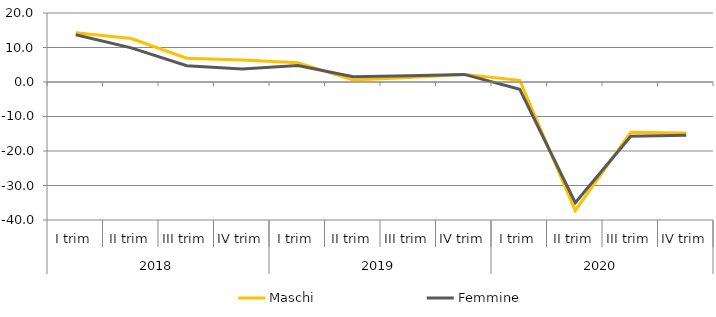
| Category | Maschi | Femmine |
|---|---|---|
| 0 | 14.3 | 13.7 |
| 1 | 12.6 | 9.9 |
| 2 | 6.9 | 4.7 |
| 3 | 6.4 | 3.8 |
| 4 | 5.6 | 4.8 |
| 5 | 0.6 | 1.5 |
| 6 | 1.3 | 1.8 |
| 7 | 2.2 | 2.2 |
| 8 | 0.5 | -2.1 |
| 9 | -37.3 | -35 |
| 10 | -14.6 | -15.7 |
| 11 | -14.8 | -15.4 |